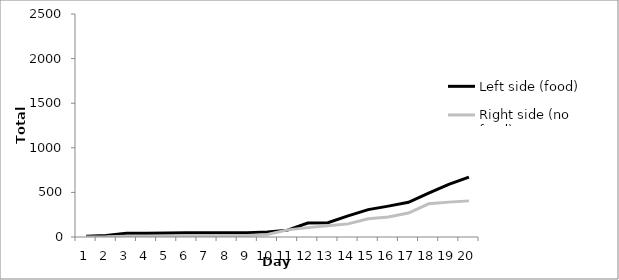
| Category | Left side (food) | Right side (no food) |
|---|---|---|
| 0 | 9 | 1 |
| 1 | 18 | 2 |
| 2 | 41 | 9 |
| 3 | 42 | 9 |
| 4 | 44 | 9 |
| 5 | 47 | 11 |
| 6 | 47 | 12 |
| 7 | 47 | 13 |
| 8 | 47 | 17 |
| 9 | 57 | 28 |
| 10 | 77 | 80 |
| 11 | 156 | 105 |
| 12 | 161 | 126 |
| 13 | 236 | 147 |
| 14 | 307 | 205 |
| 15 | 346 | 224 |
| 16 | 389 | 269 |
| 17 | 491 | 372 |
| 18 | 591 | 391 |
| 19 | 672 | 405 |